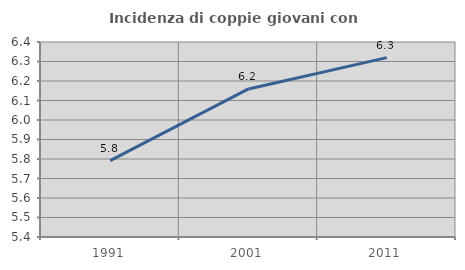
| Category | Incidenza di coppie giovani con figli |
|---|---|
| 1991.0 | 5.792 |
| 2001.0 | 6.159 |
| 2011.0 | 6.32 |